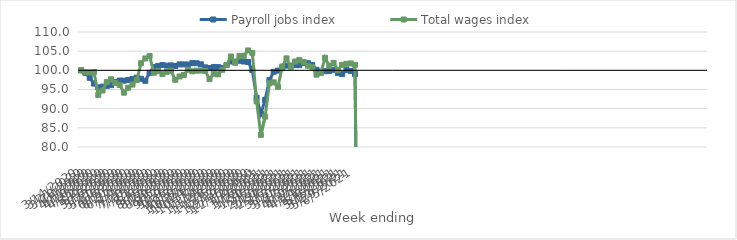
| Category | Payroll jobs index | Total wages index |
|---|---|---|
| 14/03/2020 | 100 | 100 |
| 21/03/2020 | 99.315 | 99.501 |
| 28/03/2020 | 98.046 | 99.458 |
| 04/04/2020 | 96.542 | 99.556 |
| 11/04/2020 | 95.54 | 93.575 |
| 18/04/2020 | 95.749 | 94.744 |
| 25/04/2020 | 95.945 | 96.972 |
| 02/05/2020 | 96.14 | 97.662 |
| 09/05/2020 | 96.919 | 96.716 |
| 16/05/2020 | 97.34 | 96.184 |
| 23/05/2020 | 97.309 | 94.173 |
| 30/05/2020 | 97.483 | 95.473 |
| 06/06/2020 | 97.759 | 96.283 |
| 13/06/2020 | 98.079 | 97.476 |
| 20/06/2020 | 97.789 | 101.836 |
| 27/06/2020 | 97.263 | 103.107 |
| 04/07/2020 | 99.343 | 103.732 |
| 11/07/2020 | 100.855 | 99.368 |
| 18/07/2020 | 101.166 | 99.8 |
| 25/07/2020 | 101.381 | 99.014 |
| 01/08/2020 | 101.227 | 99.602 |
| 08/08/2020 | 101.286 | 99.898 |
| 15/08/2020 | 101.132 | 97.537 |
| 22/08/2020 | 101.564 | 98.402 |
| 29/08/2020 | 101.548 | 98.803 |
| 05/09/2020 | 101.512 | 100.158 |
| 12/09/2020 | 101.891 | 99.747 |
| 19/09/2020 | 101.849 | 99.911 |
| 26/09/2020 | 101.56 | 99.95 |
| 03/10/2020 | 100.778 | 99.846 |
| 10/10/2020 | 100.593 | 97.711 |
| 17/10/2020 | 100.879 | 99.144 |
| 24/10/2020 | 100.834 | 98.942 |
| 31/10/2020 | 100.64 | 100.152 |
| 07/11/2020 | 101.387 | 101.379 |
| 14/11/2020 | 102.292 | 103.609 |
| 21/11/2020 | 102.252 | 101.967 |
| 28/11/2020 | 102.498 | 103.718 |
| 05/12/2020 | 102.297 | 103.783 |
| 12/12/2020 | 102.193 | 105.186 |
| 19/12/2020 | 100.079 | 104.566 |
| 26/12/2020 | 92.856 | 91.902 |
| 02/01/2021 | 88.686 | 83.174 |
| 09/01/2021 | 92.301 | 87.926 |
| 16/01/2021 | 97.434 | 96.628 |
| 23/01/2021 | 99.625 | 96.875 |
| 30/01/2021 | 99.94 | 95.712 |
| 06/02/2021 | 100.553 | 101.007 |
| 13/02/2021 | 101.222 | 103.118 |
| 20/02/2021 | 101.223 | 100.914 |
| 27/02/2021 | 101.351 | 102.304 |
| 06/03/2021 | 101.358 | 102.68 |
| 13/03/2021 | 101.93 | 102.18 |
| 20/03/2021 | 101.857 | 101.177 |
| 27/03/2021 | 101.399 | 100.882 |
| 03/04/2021 | 100.15 | 98.877 |
| 10/04/2021 | 99.644 | 99.281 |
| 17/04/2021 | 99.779 | 103.27 |
| 24/04/2021 | 99.815 | 101.156 |
| 01/05/2021 | 100.156 | 101.939 |
| 08/05/2021 | 99.268 | 100.1 |
| 15/05/2021 | 99.02 | 101.428 |
| 22/05/2021 | 100.055 | 101.704 |
| 29/05/2021 | 99.839 | 101.795 |
| 05/06/2021 | 99.054 | 101.441 |